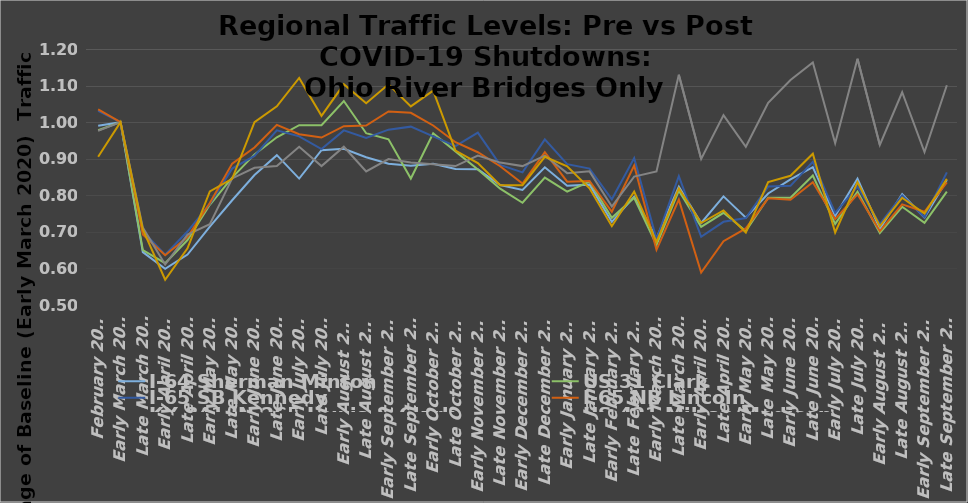
| Category | I-64 | US 31 | I-65 SB | I-65 NB | KY 841/IN 265 | US 421 |
|---|---|---|---|---|---|---|
| February 2020 | 0.99 | 0.978 | 1.031 | 1.035 | 0.976 | 0.905 |
| Early March 2020 | 1 | 1 | 1 | 1 | 1 | 1 |
| Late March 2020 | 0.645 | 0.65 | 0.701 | 0.693 | 0.712 | 0.707 |
| Early April 2020 | 0.599 | 0.614 | 0.637 | 0.636 | 0.611 | 0.569 |
| Late April 2020 | 0.638 | 0.678 | 0.701 | 0.686 | 0.692 | 0.655 |
| Early May 2020 | 0.715 | 0.774 | 0.777 | 0.779 | 0.721 | 0.81 |
| Late May 2020 | 0.786 | 0.848 | 0.873 | 0.887 | 0.846 | 0.845 |
| Early June 2020 | 0.855 | 0.912 | 0.908 | 0.931 | 0.875 | 1 |
| Late June 2020 | 0.91 | 0.959 | 0.977 | 0.993 | 0.88 | 1.043 |
| Early July 2020 | 0.846 | 0.992 | 0.961 | 0.967 | 0.933 | 1.121 |
| Late July 2020 | 0.923 | 0.992 | 0.926 | 0.958 | 0.88 | 1.017 |
| Early August 2020 | 0.927 | 1.058 | 0.977 | 0.989 | 0.933 | 1.103 |
| Late August 2020 | 0.904 | 0.97 | 0.957 | 0.991 | 0.865 | 1.052 |
| Early September 2020 | 0.886 | 0.953 | 0.98 | 1.029 | 0.899 | 1.103 |
| Late September 2020 | 0.881 | 0.846 | 0.988 | 1.026 | 0.889 | 1.043 |
| Early October 2020 | 0.886 | 0.97 | 0.961 | 0.991 | 0.885 | 1.086 |
| Late October 2020 | 0.872 | 0.92 | 0.934 | 0.945 | 0.88 | 0.922 |
| Early November 2020 | 0.871 | 0.871 | 0.971 | 0.918 | 0.909 | 0.888 |
| Late November 2020 | 0.828 | 0.818 | 0.883 | 0.879 | 0.889 | 0.828 |
| Early December 2020 | 0.815 | 0.78 | 0.863 | 0.832 | 0.88 | 0.828 |
| Late December 2020 | 0.877 | 0.848 | 0.953 | 0.918 | 0.909 | 0.905 |
| Early January 2021 | 0.826 | 0.81 | 0.885 | 0.837 | 0.861 | 0.879 |
| Late January 2021 | 0.829 | 0.837 | 0.873 | 0.839 | 0.865 | 0.819 |
| Early February 2021 | 0.727 | 0.738 | 0.789 | 0.755 | 0.769 | 0.716 |
| Late February 2021 | 0.796 | 0.793 | 0.902 | 0.881 | 0.851 | 0.81 |
| Early March 2021 | 0.683 | 0.664 | 0.68 | 0.651 | 0.865 | 0.672 |
| Late March 2021 | 0.823 | 0.813 | 0.852 | 0.788 | 1.13 | 0.819 |
| Early April 2021 | 0.724 | 0.713 | 0.686 | 0.589 | 0.899 | 0.724 |
| Late April 2021 | 0.797 | 0.752 | 0.727 | 0.675 | 1.019 | 0.759 |
| Early May 2021 | 0.739 | 0.702 | 0.738 | 0.709 | 0.933 | 0.698 |
| Late May 2021 | 0.805 | 0.793 | 0.824 | 0.792 | 1.053 | 0.836 |
| Early June 2021 | 0.844 | 0.793 | 0.826 | 0.788 | 1.115 | 0.853 |
| Late June 2021 | 0.877 | 0.854 | 0.891 | 0.835 | 1.163 | 0.914 |
| Early July 2021 | 0.744 | 0.722 | 0.752 | 0.735 | 0.942 | 0.698 |
| Late July 2021 | 0.846 | 0.81 | 0.824 | 0.803 | 1.173 | 0.836 |
| Early August 2021 | 0.708 | 0.697 | 0.721 | 0.702 | 0.938 | 0.716 |
| Late August 2021 | 0.803 | 0.769 | 0.799 | 0.775 | 1.082 | 0.793 |
| Early September 2021 | 0.739 | 0.725 | 0.74 | 0.755 | 0.918 | 0.75 |
| Late September 2021 | 0.842 | 0.81 | 0.863 | 0.835 | 1.101 | 0.845 |